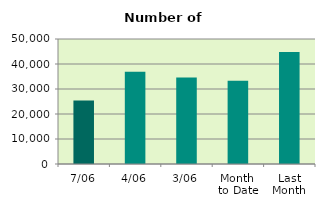
| Category | Series 0 |
|---|---|
| 7/06 | 25366 |
| 4/06 | 36948 |
| 3/06 | 34632 |
| Month 
to Date | 33318 |
| Last
Month | 44751.81 |